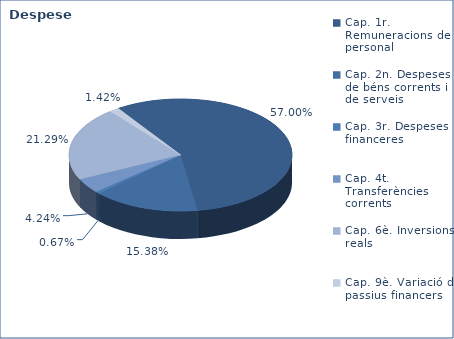
| Category | Series 0 |
|---|---|
| Cap. 1r. Remuneracions de personal | 176990859 |
| Cap. 2n. Despeses de béns corrents i de serveis | 47759947 |
| Cap. 3r. Despeses financeres | 2086000 |
| Cap. 4t. Transferències corrents | 13149896 |
| Cap. 6è. Inversions reals | 66095610 |
| Cap. 9è. Variació de passius financers | 4422317 |